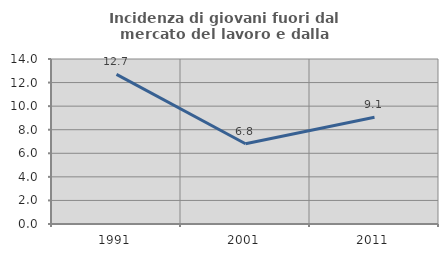
| Category | Incidenza di giovani fuori dal mercato del lavoro e dalla formazione  |
|---|---|
| 1991.0 | 12.7 |
| 2001.0 | 6.809 |
| 2011.0 | 9.054 |